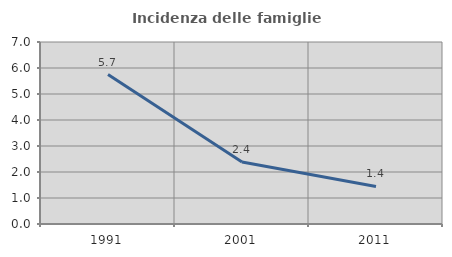
| Category | Incidenza delle famiglie numerose |
|---|---|
| 1991.0 | 5.75 |
| 2001.0 | 2.383 |
| 2011.0 | 1.443 |